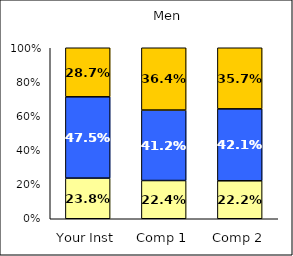
| Category | Low Academic Self-Concept | Average Academic Self-Concept | High Academic Self-Concept |
|---|---|---|---|
| Your Inst | 0.238 | 0.475 | 0.287 |
| Comp 1 | 0.224 | 0.412 | 0.364 |
| Comp 2 | 0.222 | 0.421 | 0.357 |